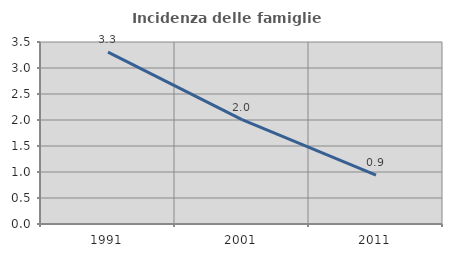
| Category | Incidenza delle famiglie numerose |
|---|---|
| 1991.0 | 3.305 |
| 2001.0 | 2.007 |
| 2011.0 | 0.941 |